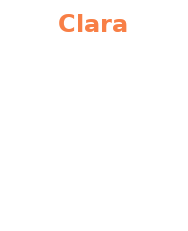
| Category | Clara |
|---|---|
| 0 | 0 |
| 1 | 0 |